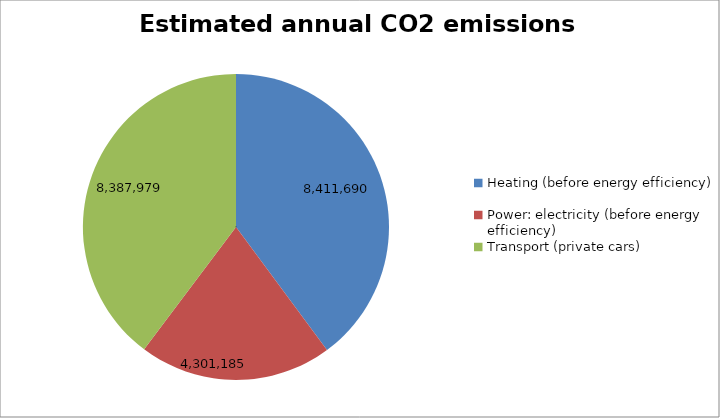
| Category | Estimated annual CO2 emissions (kg/yr) |
|---|---|
| Heating (before energy efficiency) | 8411690.285 |
| Power: electricity (before energy efficiency) | 4301184.629 |
| Transport (private cars) | 8387978.764 |